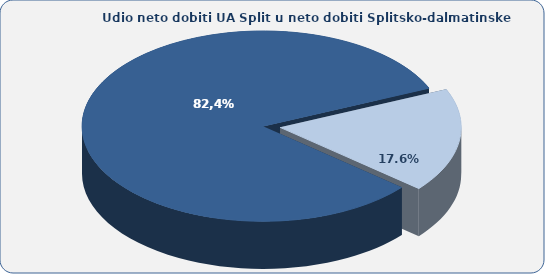
| Category | Series 1 |
|---|---|
| UA Split | 82.35 |
| SDŽ (ostali gradovi i općine) | 17.65 |